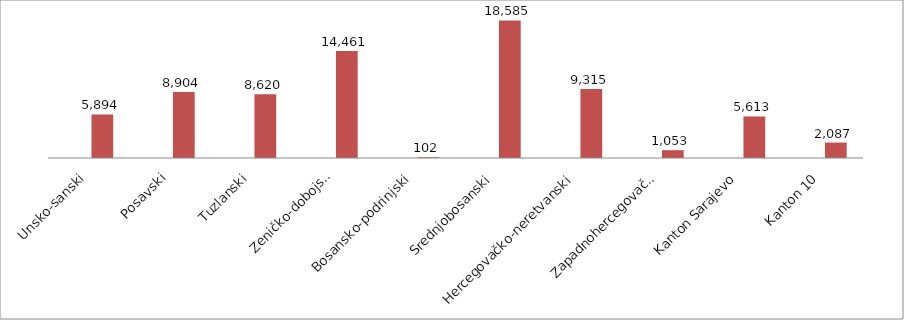
| Category | Series 0 | Series 1 |
|---|---|---|
| Unsko-sanski |  | 5894 |
| Posavski |  | 8904 |
| Tuzlanski |  | 8620 |
| Zeničko-dobojski |  | 14461 |
| Bosansko-podrinjski |  | 102 |
| Srednjobosanski |  | 18585 |
| Hercegovačko-neretvanski |  | 9315 |
| Zapadnohercegovački |  | 1053 |
| Kanton Sarajevo |  | 5613 |
| Kanton 10 |  | 2087 |